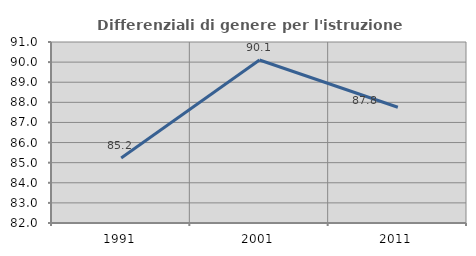
| Category | Differenziali di genere per l'istruzione superiore |
|---|---|
| 1991.0 | 85.236 |
| 2001.0 | 90.105 |
| 2011.0 | 87.757 |